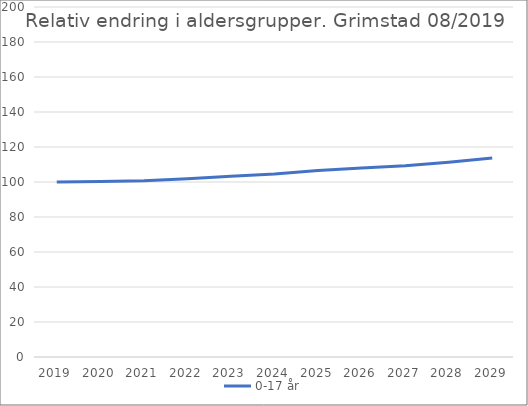
| Category | 0-17 år |
|---|---|
| 2019 | 100 |
| 2020 | 100.348 |
| 2021 | 100.678 |
| 2022 | 101.919 |
| 2023 | 103.335 |
| 2024 | 104.583 |
| 2025 | 106.587 |
| 2026 | 108.003 |
| 2027 | 109.331 |
| 2028 | 111.298 |
| 2029 | 113.653 |